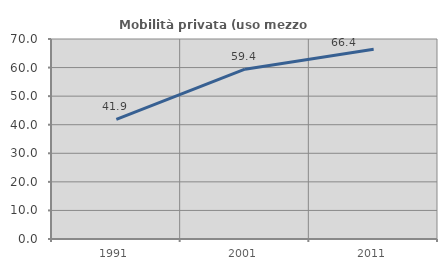
| Category | Mobilità privata (uso mezzo privato) |
|---|---|
| 1991.0 | 41.863 |
| 2001.0 | 59.435 |
| 2011.0 | 66.429 |